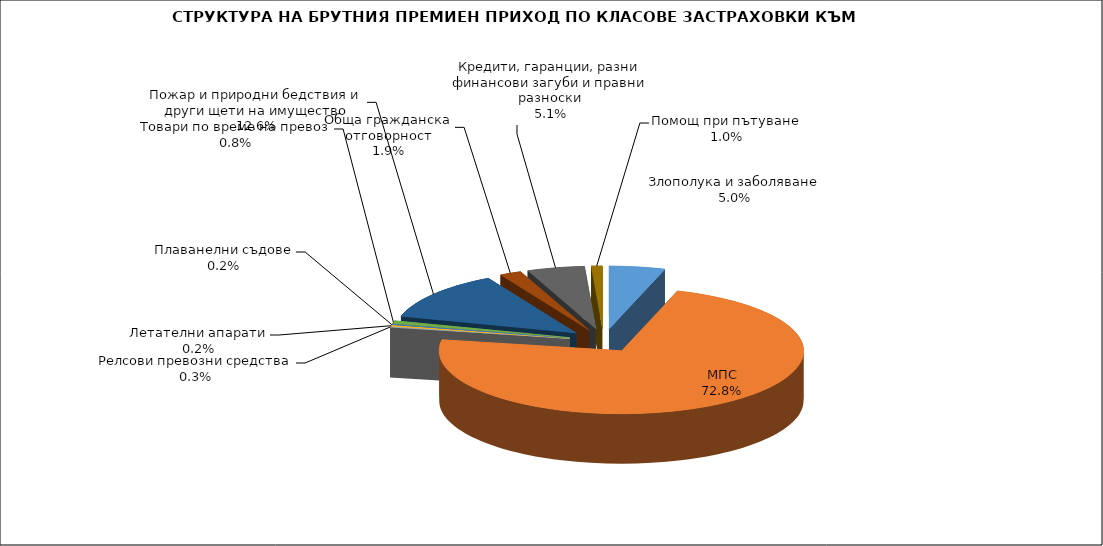
| Category | Злополука и заболяване |
|---|---|
| Злополука и заболяване | 0.05 |
| МПС | 0.728 |
| Релсови превозни средства | 0.003 |
| Летателни апарати | 0.002 |
| Плаванелни съдове | 0.002 |
| Товари по време на превоз | 0.008 |
| Пожар и природни бедствия и други щети на имущество | 0.126 |
| Обща гражданска отговорност | 0.019 |
| Кредити, гаранции, разни финансови загуби и правни разноски | 0.051 |
| Помощ при пътуване | 0.01 |